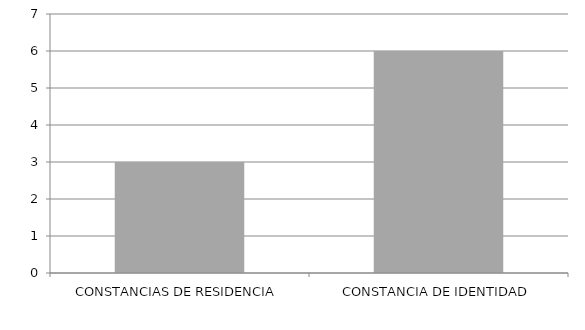
| Category | Series 0 |
|---|---|
| CONSTANCIAS DE RESIDENCIA | 3 |
| CONSTANCIA DE IDENTIDAD | 6 |